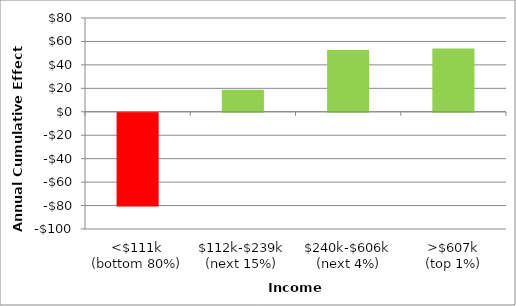
| Category | Series 0 |
|---|---|
| <$111k
(bottom 80%) | -80.007 |
| $112k-$239k
(next 15%) | 18.86 |
| $240k-$606k
(next 4%) | 52.645 |
| >$607k
(top 1%) | 53.9 |